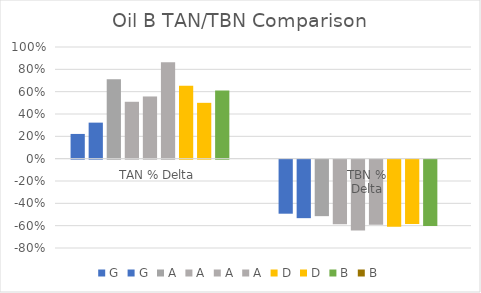
| Category | G | A | D | B |
|---|---|---|---|---|
| TAN % Delta | 0.323 | 0.863 | 0.5 | 0 |
| TBN %
Delta | -0.524 | -0.584 | -0.577 | 0 |